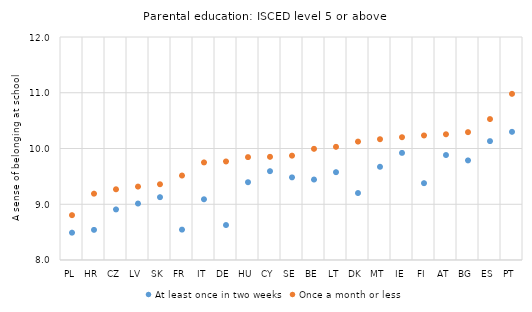
| Category | At least once in two weeks | Once a month or less |
|---|---|---|
| PL | 8.49 | 8.804 |
| HR | 8.541 | 9.19 |
| CZ | 8.907 | 9.268 |
| LV | 9.013 | 9.317 |
| SK | 9.127 | 9.359 |
| FR | 8.545 | 9.515 |
| IT | 9.09 | 9.75 |
| DE | 8.627 | 9.768 |
| HU | 9.395 | 9.845 |
| CY | 9.593 | 9.851 |
| SE | 9.482 | 9.872 |
| BE | 9.443 | 9.994 |
| LT | 9.575 | 10.03 |
| DK | 9.202 | 10.124 |
| MT | 9.672 | 10.167 |
| IE | 9.921 | 10.202 |
| FI | 9.378 | 10.234 |
| AT | 9.883 | 10.255 |
| BG | 9.786 | 10.293 |
| ES | 10.132 | 10.528 |
| PT | 10.299 | 10.98 |